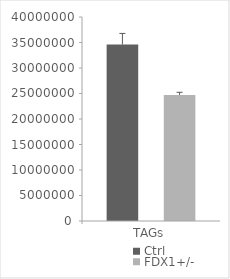
| Category | Ctrl | FDX1+/- |
|---|---|---|
| TAGs | 34607551.258 | 24714326.318 |